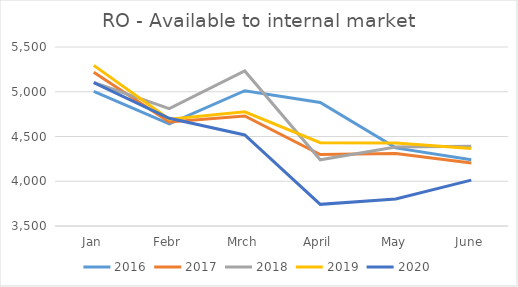
| Category | 2016 | 2017 | 2018 | 2019 | 2020 |
|---|---|---|---|---|---|
| Jan | 5004 | 5217 | 5103 | 5295 | 5102 |
| Febr | 4641 | 4662 | 4811 | 4694 | 4703 |
| Mrch | 5012 | 4729 | 5232 | 4776 | 4517 |
| April | 4881 | 4299 | 4240 | 4431 | 3742 |
| May | 4373 | 4310 | 4382 | 4427 | 3801 |
| June | 4241 | 4205 | 4391 | 4367 | 4013 |